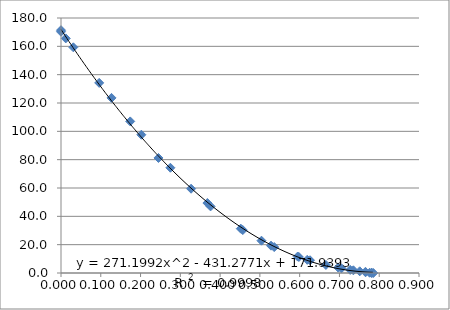
| Category | Series 0 |
|---|---|
| 0.0 | 171.4 |
| 0.0 | 170.3 |
| 0.012 | 165.6 |
| 0.031 | 159.3 |
| 0.096 | 134.2 |
| 0.127 | 123.6 |
| 0.174 | 107 |
| 0.202 | 97.6 |
| 0.245 | 81.2 |
| 0.275 | 74.3 |
| 0.327 | 59.5 |
| 0.368 | 49.4 |
| 0.376 | 47 |
| 0.452 | 31.3 |
| 0.457 | 30.3 |
| 0.504 | 22.8 |
| 0.528 | 19.3 |
| 0.536 | 18.3 |
| 0.595 | 11.6 |
| 0.598 | 11.3 |
| 0.619 | 9.3 |
| 0.626 | 9 |
| 0.666 | 5.7 |
| 0.697 | 3.8 |
| 0.705 | 3.3 |
| 0.727 | 2.2 |
| 0.735 | 1.9 |
| 0.751 | 1.2 |
| 0.765 | 0.7 |
| 0.766 | 0.6 |
| 0.776 | 0.2 |
| 0.781 | 0.1 |
| 0.781 | 0.1 |
| 0.785 | 0 |